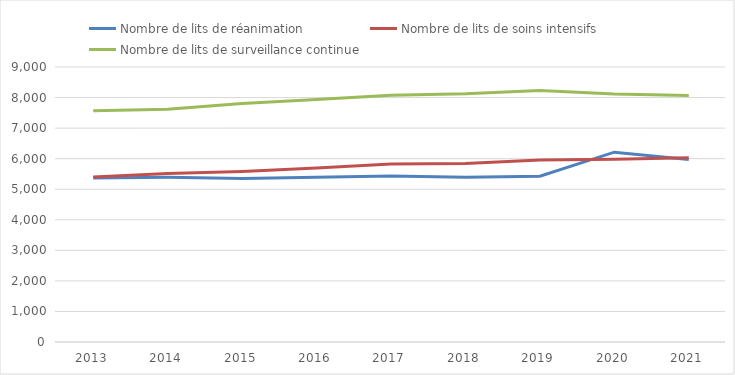
| Category | Nombre de lits de réanimation | Nombre de lits de soins intensifs | Nombre de lits de surveillance continue |
|---|---|---|---|
| 2013 | 5369 | 5398 | 7571 |
| 2014 | 5388 | 5515 | 7620 |
| 2015 | 5354 | 5584 | 7803 |
| 2016 | 5391 | 5692 | 7935 |
| 2017 | 5436 | 5822 | 8075 |
| 2018 | 5392 | 5844 | 8123 |
| 2019 | 5423 | 5954 | 8230 |
| 2020 | 6212 | 5984 | 8114 |
| 2021 | 5976 | 6033 | 8065 |